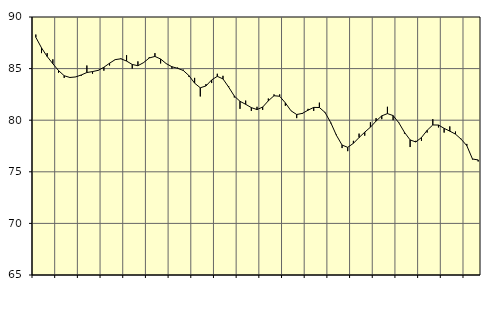
| Category | Piggar | Series 1 |
|---|---|---|
| nan | 88.3 | 88.03 |
| 1.0 | 86.5 | 87.01 |
| 1.0 | 86.5 | 86.17 |
| 1.0 | 85.9 | 85.47 |
| nan | 84.6 | 84.81 |
| 2.0 | 84.1 | 84.31 |
| 2.0 | 84.1 | 84.14 |
| 2.0 | 84.2 | 84.19 |
| nan | 84.3 | 84.38 |
| 3.0 | 85.3 | 84.62 |
| 3.0 | 84.5 | 84.71 |
| 3.0 | 84.8 | 84.83 |
| nan | 84.8 | 85.13 |
| 4.0 | 85.3 | 85.52 |
| 4.0 | 85.9 | 85.87 |
| 4.0 | 86 | 85.95 |
| nan | 86.3 | 85.73 |
| 5.0 | 85 | 85.4 |
| 5.0 | 85.7 | 85.28 |
| 5.0 | 85.6 | 85.58 |
| nan | 86.1 | 86.03 |
| 6.0 | 86.5 | 86.18 |
| 6.0 | 85.5 | 85.93 |
| 6.0 | 85.5 | 85.48 |
| nan | 85 | 85.18 |
| 7.0 | 85.1 | 85.03 |
| 7.0 | 84.9 | 84.82 |
| 7.0 | 84.2 | 84.32 |
| nan | 84.1 | 83.59 |
| 8.0 | 82.3 | 83.14 |
| 8.0 | 83.5 | 83.32 |
| 8.0 | 83.6 | 83.9 |
| nan | 84.5 | 84.25 |
| 9.0 | 84.3 | 84 |
| 9.0 | 83.3 | 83.21 |
| 9.0 | 82.2 | 82.34 |
| nan | 81.1 | 81.83 |
| 10.0 | 81.9 | 81.54 |
| 10.0 | 80.9 | 81.22 |
| 10.0 | 81.3 | 81.03 |
| nan | 81 | 81.27 |
| 11.0 | 82.1 | 81.88 |
| 11.0 | 82.5 | 82.37 |
| 11.0 | 82.5 | 82.32 |
| nan | 81.4 | 81.68 |
| 12.0 | 80.9 | 80.91 |
| 12.0 | 80.2 | 80.55 |
| 12.0 | 80.6 | 80.66 |
| nan | 81.1 | 80.97 |
| 13.0 | 80.9 | 81.24 |
| 13.0 | 81.7 | 81.23 |
| 13.0 | 80.8 | 80.75 |
| nan | 79.7 | 79.77 |
| 14.0 | 78.6 | 78.54 |
| 14.0 | 77.3 | 77.59 |
| 14.0 | 77 | 77.37 |
| nan | 78 | 77.76 |
| 15.0 | 78.7 | 78.32 |
| 15.0 | 78.5 | 78.84 |
| 15.0 | 79.8 | 79.32 |
| nan | 80.2 | 79.92 |
| 16.0 | 80.1 | 80.42 |
| 16.0 | 81.3 | 80.64 |
| 16.0 | 80 | 80.45 |
| nan | 79.8 | 79.76 |
| 17.0 | 78.7 | 78.83 |
| 17.0 | 77.4 | 78.09 |
| 17.0 | 78 | 77.89 |
| nan | 78 | 78.32 |
| 18.0 | 78.8 | 79.02 |
| 18.0 | 80.1 | 79.54 |
| 18.0 | 79.3 | 79.53 |
| nan | 78.8 | 79.21 |
| 19.0 | 79.4 | 78.94 |
| 19.0 | 78.9 | 78.65 |
| 19.0 | 78.2 | 78.16 |
| nan | 77.7 | 77.53 |
| 20.0 | 76.2 | 76.24 |
| 20.0 | 76 | 76.15 |